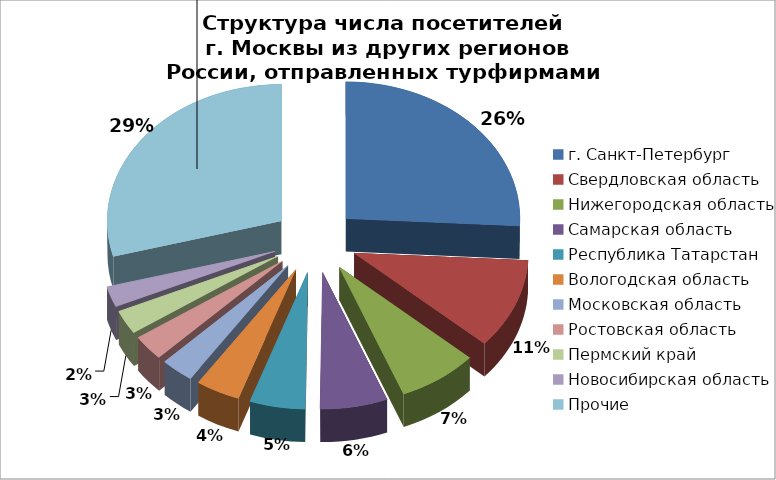
| Category | Series 0 |
|---|---|
| г. Санкт-Петербург | 25.849 |
| Свердловская область | 10.686 |
| Нижегородская область | 7.434 |
| Самарская область | 6.255 |
| Республика Татарстан | 5.137 |
| Вологодская область | 4.109 |
| Московская область | 3.061 |
| Ростовская область | 2.993 |
| Пермский край | 2.843 |
| Новосибирская область | 2.437 |
| Прочие | 29.196 |